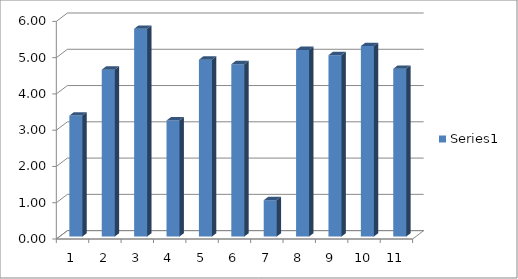
| Category | Series 0 |
|---|---|
| 0 | 3.333 |
| 1 | 4.6 |
| 2 | 5.727 |
| 3 | 3.2 |
| 4 | 4.875 |
| 5 | 4.75 |
| 6 | 1 |
| 7 | 5.143 |
| 8 | 5 |
| 9 | 5.25 |
| 10 | 4.625 |